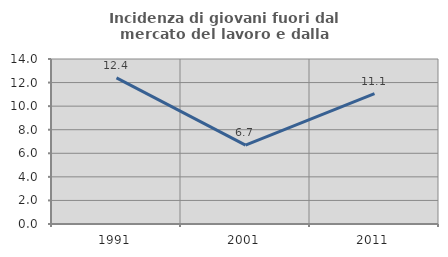
| Category | Incidenza di giovani fuori dal mercato del lavoro e dalla formazione  |
|---|---|
| 1991.0 | 12.402 |
| 2001.0 | 6.695 |
| 2011.0 | 11.065 |